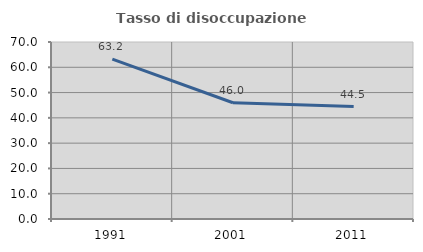
| Category | Tasso di disoccupazione giovanile  |
|---|---|
| 1991.0 | 63.239 |
| 2001.0 | 45.985 |
| 2011.0 | 44.487 |